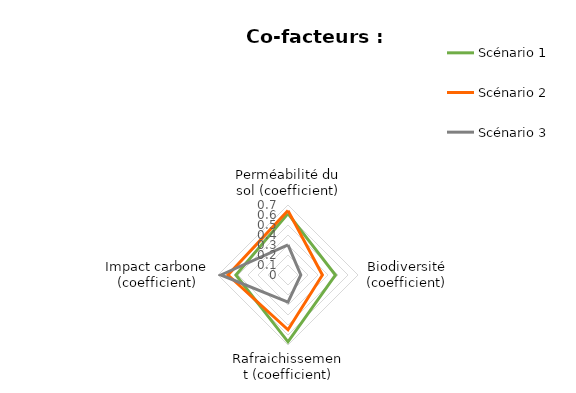
| Category | Scénario 1 | Scénario 2 | Scénario 3 |
|---|---|---|---|
| Perméabilité du sol (coefficient) | 0.614 | 0.644 | 0.301 |
| Biodiversité (coefficient) | 0.474 | 0.344 | 0.128 |
| Rafraichissement (coefficient) | 0.668 | 0.548 | 0.272 |
| Impact carbone (coefficient) | 0.521 | 0.6 | 0.671 |